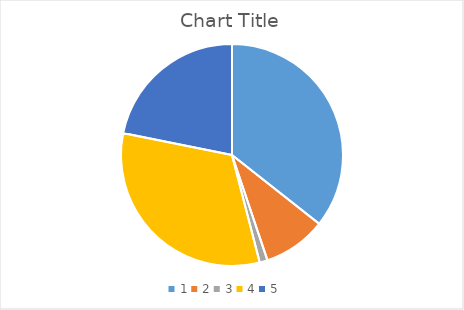
| Category | Series 0 |
|---|---|
| 0 | 35.632 |
| 1 | 9.195 |
| 2 | 1.149 |
| 3 | 32.184 |
| 4 | 21.839 |